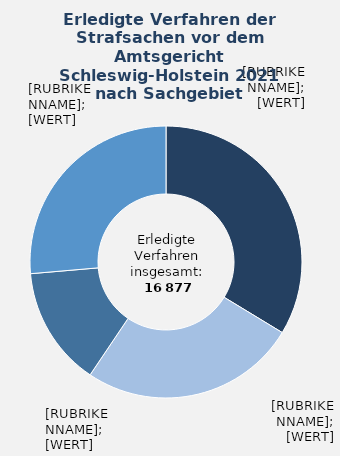
| Category | in Prozent |
|---|---|
| Eigentums- und Vermögensdelikte | 0.337 |
| Sonstige Straftaten | 0.258 |
| Verkehrsstraftaten | 0.142 |
| Übrige Sachgebiete¹  | 0.264 |